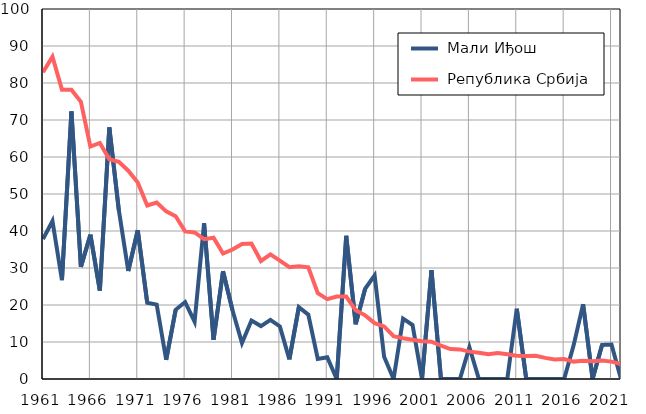
| Category |  Мали Иђош |  Република Србија |
|---|---|---|
| 1961.0 | 37.8 | 82.9 |
| 1962.0 | 42.7 | 87.1 |
| 1963.0 | 26.7 | 78.2 |
| 1964.0 | 72.3 | 78.2 |
| 1965.0 | 30.3 | 74.9 |
| 1966.0 | 39 | 62.8 |
| 1967.0 | 23.9 | 63.8 |
| 1968.0 | 68 | 59.4 |
| 1969.0 | 45.7 | 58.7 |
| 1970.0 | 29.2 | 56.3 |
| 1971.0 | 40.2 | 53.1 |
| 1972.0 | 20.6 | 46.9 |
| 1973.0 | 20.1 | 47.7 |
| 1974.0 | 5.2 | 45.3 |
| 1975.0 | 18.7 | 44 |
| 1976.0 | 20.8 | 39.9 |
| 1977.0 | 15.5 | 39.6 |
| 1978.0 | 42.1 | 37.8 |
| 1979.0 | 10.6 | 38.2 |
| 1980.0 | 29.1 | 33.9 |
| 1981.0 | 18.6 | 35 |
| 1982.0 | 9.7 | 36.5 |
| 1983.0 | 15.8 | 36.6 |
| 1984.0 | 14.3 | 31.9 |
| 1985.0 | 16 | 33.7 |
| 1986.0 | 14.2 | 32 |
| 1987.0 | 5.3 | 30.2 |
| 1988.0 | 19.4 | 30.5 |
| 1989.0 | 17.4 | 30.2 |
| 1990.0 | 5.4 | 23.2 |
| 1991.0 | 5.9 | 21.6 |
| 1992.0 | 0 | 22.3 |
| 1993.0 | 38.7 | 22.3 |
| 1994.0 | 14.8 | 18.6 |
| 1995.0 | 24.4 | 17.2 |
| 1996.0 | 28 | 15.1 |
| 1997.0 | 6 | 14.2 |
| 1998.0 | 0 | 11.6 |
| 1999.0 | 16.3 | 11 |
| 2000.0 | 14.6 | 10.6 |
| 2001.0 | 0 | 10.2 |
| 2002.0 | 29.4 | 10.1 |
| 2003.0 | 0 | 9 |
| 2004.0 | 0 | 8.1 |
| 2005.0 | 0 | 8 |
| 2006.0 | 8.6 | 7.4 |
| 2007.0 | 0 | 7.1 |
| 2008.0 | 0 | 6.7 |
| 2009.0 | 0 | 7 |
| 2010.0 | 0 | 6.7 |
| 2011.0 | 19 | 6.3 |
| 2012.0 | 0 | 6.2 |
| 2013.0 | 0 | 6.3 |
| 2014.0 | 0 | 5.7 |
| 2015.0 | 0 | 5.3 |
| 2016.0 | 0 | 5.4 |
| 2017.0 | 9.1 | 4.7 |
| 2018.0 | 20.2 | 4.9 |
| 2019.0 | 0 | 4.8 |
| 2020.0 | 9.2 | 5 |
| 2021.0 | 9.3 | 4.7 |
| 2022.0 | 0 | 4 |